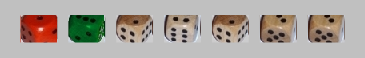
| Category | 1 | 2 | 3 | 4 | 5 | 6 |
|---|---|---|---|---|---|---|
| 1.0 | 1 | 0 | 0 | 0 | 0 | 0 |
| 6.0 | -1 | 0 | 0 | 0 | 0 | 1 |
| 2.0 | -1 | 1 | 0 | 0 | 0 | 0 |
| 4.0 | -1 | 0 | 0 | 1 | 0 | 0 |
| 2.0 | -1 | 1 | 0 | 0 | 0 | 0 |
| 3.0 | -1 | 0 | 1 | 0 | 0 | 0 |
| 3.0 | -1 | 0 | 1 | 0 | 0 | 0 |